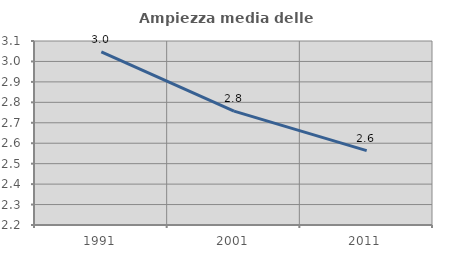
| Category | Ampiezza media delle famiglie |
|---|---|
| 1991.0 | 3.047 |
| 2001.0 | 2.757 |
| 2011.0 | 2.564 |